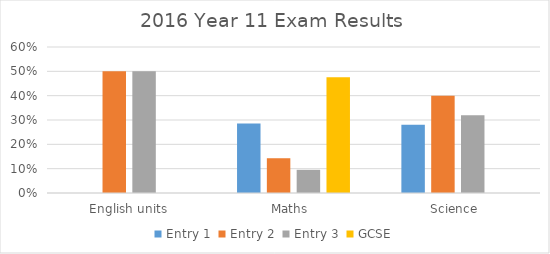
| Category | Entry 1 | Entry 2 | Entry 3 | GCSE |
|---|---|---|---|---|
| English units | 0 | 0.5 | 0.5 | 0 |
| Maths  | 0.286 | 0.143 | 0.095 | 0.476 |
| Science  | 0.28 | 0.4 | 0.32 | 0 |